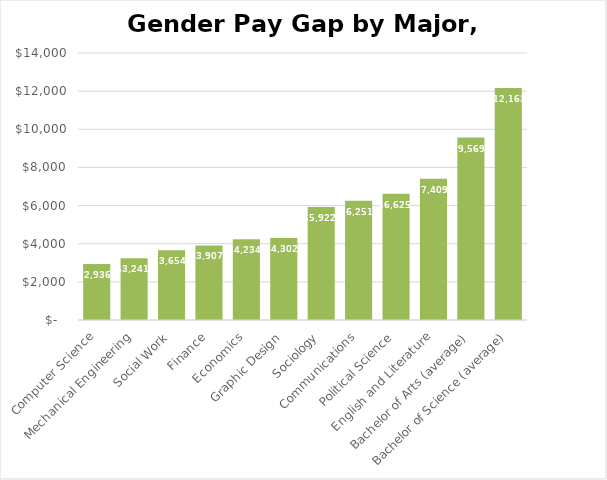
| Category | Difference |
|---|---|
| Computer Science | 2936 |
| Mechanical Engineering | 3241 |
| Social Work | 3654 |
| Finance | 3907 |
| Economics | 4234 |
| Graphic Design | 4302 |
| Sociology | 5922 |
| Communications | 6251 |
| Political Science | 6625 |
| English and Literature | 7409 |
| Bachelor of Arts (average) | 9569 |
| Bachelor of Science (average) | 12163 |